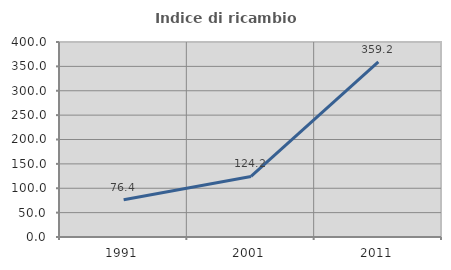
| Category | Indice di ricambio occupazionale  |
|---|---|
| 1991.0 | 76.386 |
| 2001.0 | 124.235 |
| 2011.0 | 359.223 |